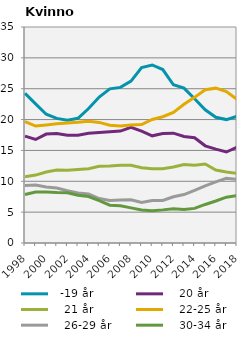
| Category |   -19 år |    20 år |    21 år |    22-25 år |    26-29 år |    30-34 år |
|---|---|---|---|---|---|---|
| 1998.0 | 24.258 | 17.307 | 10.727 | 19.679 | 9.33 | 7.848 |
| 1999.0 | 22.55 | 16.773 | 11.006 | 18.944 | 9.412 | 8.271 |
| 2000.0 | 20.867 | 17.649 | 11.514 | 19.12 | 9.064 | 8.267 |
| 2001.0 | 20.197 | 17.759 | 11.819 | 19.304 | 8.91 | 8.171 |
| 2002.0 | 19.897 | 17.459 | 11.791 | 19.449 | 8.477 | 8.155 |
| 2003.0 | 20.207 | 17.452 | 11.913 | 19.559 | 8.102 | 7.74 |
| 2004.0 | 21.794 | 17.776 | 12.036 | 19.721 | 7.932 | 7.535 |
| 2005.0 | 23.656 | 17.903 | 12.449 | 19.54 | 7.205 | 6.863 |
| 2006.0 | 24.98 | 18.036 | 12.474 | 19.072 | 6.892 | 6.132 |
| 2007.0 | 25.217 | 18.131 | 12.58 | 18.957 | 6.952 | 6.04 |
| 2008.0 | 26.231 | 18.728 | 12.592 | 19.125 | 6.989 | 5.692 |
| 2009.0 | 28.43 | 18.132 | 12.185 | 19.197 | 6.559 | 5.354 |
| 2010.0 | 28.848 | 17.368 | 12.041 | 20.013 | 6.883 | 5.236 |
| 2011.0 | 28.101 | 17.732 | 12.051 | 20.458 | 6.9 | 5.367 |
| 2012.0 | 25.636 | 17.794 | 12.326 | 21.151 | 7.484 | 5.563 |
| 2013.0 | 25.094 | 17.261 | 12.706 | 22.471 | 7.847 | 5.433 |
| 2014.0 | 23.367 | 17.052 | 12.618 | 23.598 | 8.513 | 5.608 |
| 2015.0 | 21.587 | 15.748 | 12.803 | 24.842 | 9.255 | 6.244 |
| 2016.0 | 20.379 | 15.215 | 11.82 | 25.092 | 9.895 | 6.807 |
| 2017.0 | 19.998 | 14.743 | 11.503 | 24.544 | 10.477 | 7.423 |
| 2018.0 | 20.533 | 15.514 | 11.279 | 23.258 | 10.305 | 7.665 |